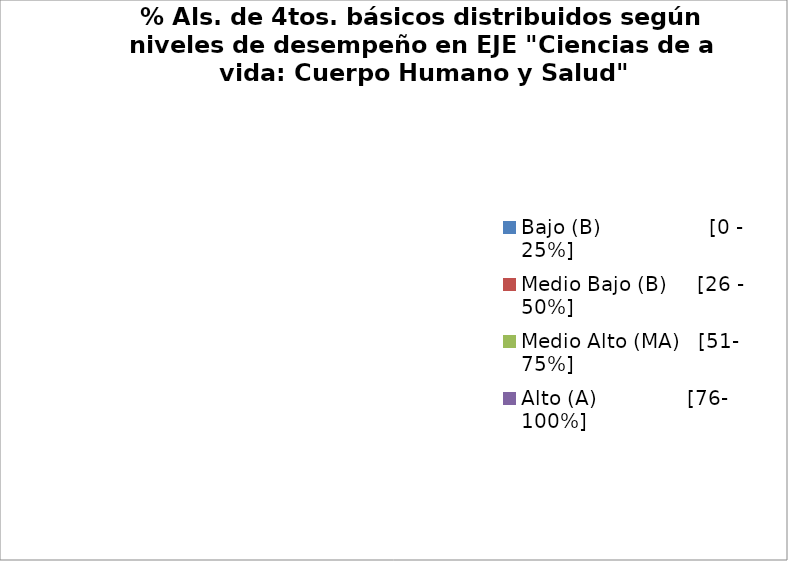
| Category | Series 0 |
|---|---|
| Bajo (B)                  [0 - 25%] | 0 |
| Medio Bajo (B)     [26 - 50%] | 0 |
| Medio Alto (MA)   [51- 75%] | 0 |
| Alto (A)               [76- 100%] | 0 |